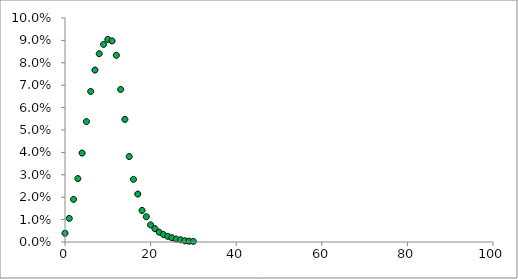
| Category | Series 0 |
|---|---|
| 0.0 | 0.004 |
| 1.0 | 0.011 |
| 2.0 | 0.019 |
| 3.0 | 0.028 |
| 4.0 | 0.04 |
| 5.0 | 0.054 |
| 6.0 | 0.067 |
| 7.0 | 0.077 |
| 8.0 | 0.084 |
| 9.0 | 0.088 |
| 10.0 | 0.09 |
| 11.0 | 0.09 |
| 12.0 | 0.083 |
| 13.0 | 0.068 |
| 14.0 | 0.055 |
| 15.0 | 0.038 |
| 16.0 | 0.028 |
| 17.0 | 0.021 |
| 18.0 | 0.014 |
| 19.0 | 0.011 |
| 20.0 | 0.008 |
| 21.0 | 0.006 |
| 22.0 | 0.004 |
| 23.0 | 0.003 |
| 24.0 | 0.003 |
| 25.0 | 0.002 |
| 26.0 | 0.001 |
| 27.0 | 0.001 |
| 28.0 | 0.001 |
| 29.0 | 0 |
| 30.0 | 0 |